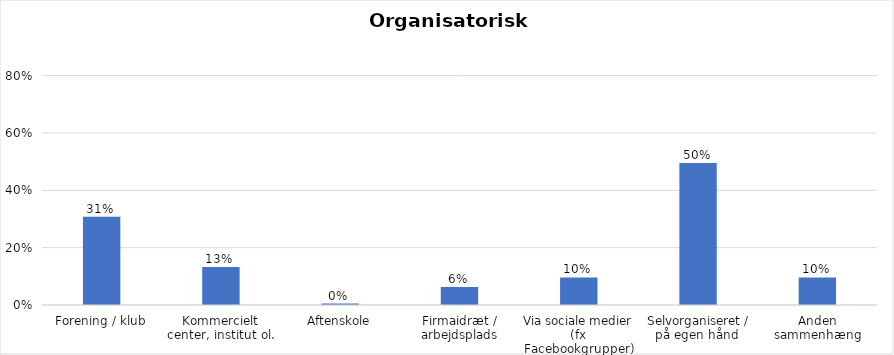
| Category | % |
|---|---|
| Forening / klub | 0.308 |
| Kommercielt center, institut ol. | 0.132 |
| Aftenskole | 0.005 |
| Firmaidræt / arbejdsplads | 0.062 |
| Via sociale medier (fx Facebookgrupper) | 0.096 |
| Selvorganiseret / på egen hånd  | 0.495 |
| Anden sammenhæng | 0.096 |